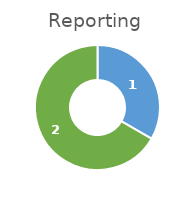
| Category | Amount |
|---|---|
| Met | 1 |
| Missed | 2 |